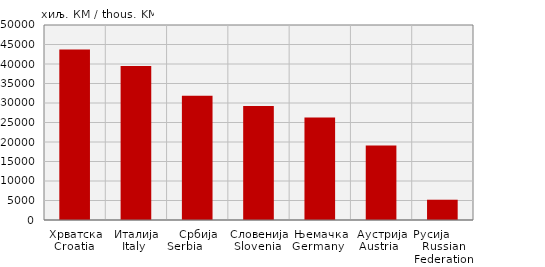
| Category | Извоз
Export |
|---|---|
| Хрватска
Croatia  | 43709 |
| Италија
Italy  | 39496 |
| Србија
Serbia              | 31834 |
| Словенија
Slovenia  | 29215 |
| Њемачка
Germany   | 26279 |
| Аустрија
Austria   | 19084 |
| Русија        Russian Federation | 5199 |